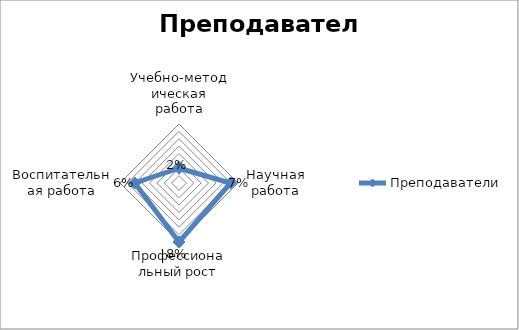
| Category | Преподаватели |
|---|---|
| Учебно-методическая работа | 0.02 |
| Научная работа | 0.07 |
| Профессиональный рост | 0.08 |
| Воспитательная работа | 0.06 |